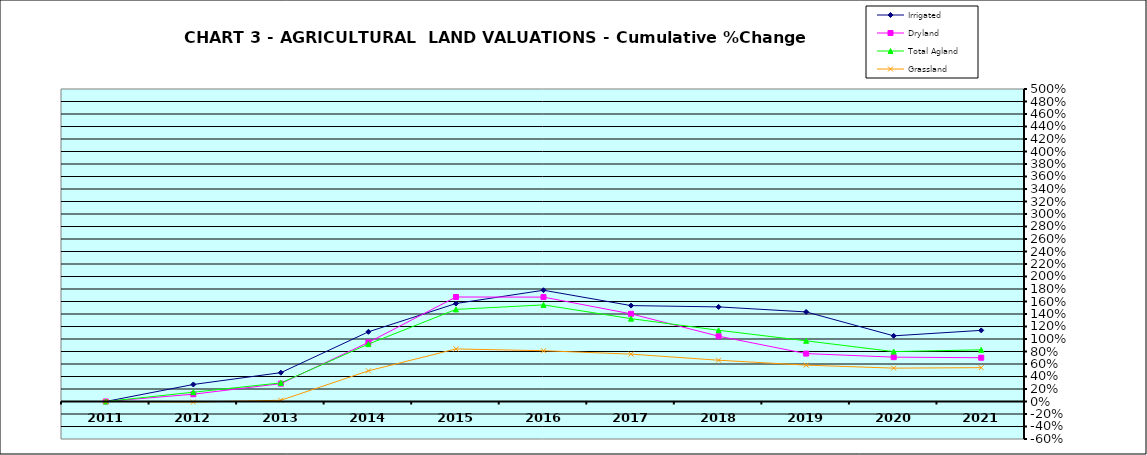
| Category | Irrigated | Dryland | Total Agland | Grassland |
|---|---|---|---|---|
| 2011.0 | 0 | 0 | 0 | 0 |
| 2012.0 | 0.272 | 0.117 | 0.148 | -0.009 |
| 2013.0 | 0.461 | 0.286 | 0.298 | 0.02 |
| 2014.0 | 1.115 | 0.946 | 0.918 | 0.491 |
| 2015.0 | 1.568 | 1.672 | 1.474 | 0.841 |
| 2016.0 | 1.78 | 1.67 | 1.546 | 0.813 |
| 2017.0 | 1.534 | 1.402 | 1.326 | 0.758 |
| 2018.0 | 1.514 | 1.045 | 1.14 | 0.66 |
| 2019.0 | 1.433 | 0.767 | 0.971 | 0.582 |
| 2020.0 | 1.051 | 0.71 | 0.798 | 0.534 |
| 2021.0 | 1.138 | 0.7 | 0.827 | 0.541 |